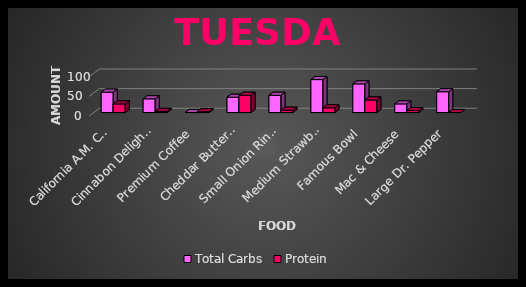
| Category | Total Carbs | Protein |
|---|---|---|
| California A.M. Crunchwrap | 52 | 22 |
| Cinnabon Delights - 4 Pack | 35 | 3 |
| Premium Coffee | 0 | 2 |
| Cheddar ButterBurger | 39 | 44 |
| Small Onion Rings | 44 | 6 |
| Medium Strawberry Shake | 84 | 12 |
| Famous Bowl | 73 | 32 |
| Mac & Cheese | 22 | 5 |
| Large Dr. Pepper | 53 | 0 |